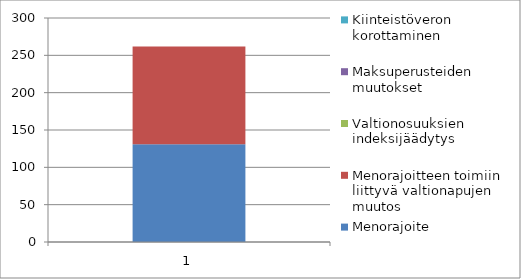
| Category | Menorajoite | Menorajoitteen toimiin liittyvä valtionapujen muutos | Valtionosuuksien indeksijäädytys | Maksuperusteiden muutokset | Kiinteistöveron korottaminen |
|---|---|---|---|---|---|
| 0 | 130.9 | 130.9 | 0 | 0 |  |